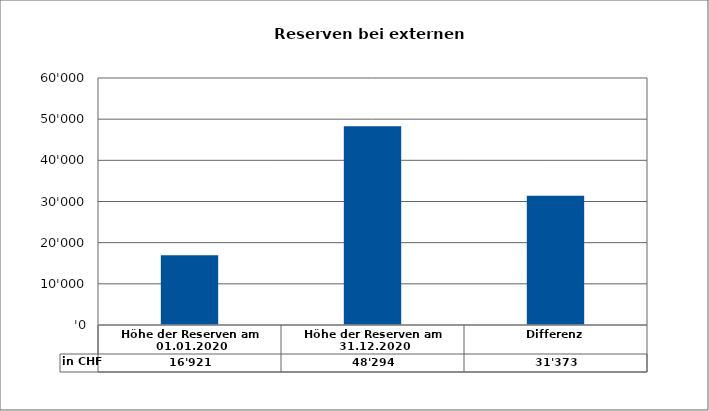
| Category | in CHF |
|---|---|
| Höhe der Reserven am 01.01.2020 | 16920.52 |
| Höhe der Reserven am 31.12.2020 | 48293.82 |
| Differenz | 31373.3 |